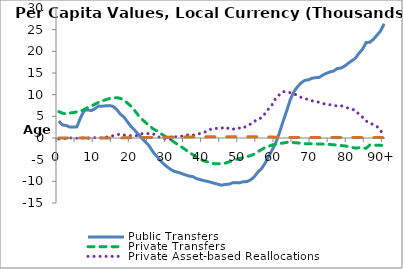
| Category | Public Transfers | Private Transfers | Private Asset-based Reallocations | Public Asset-based Reallocations |
|---|---|---|---|---|
| 0 | 3890.903 | 6072.071 | -239.489 | 11.454 |
|  | 3004.658 | 5733.146 | -129.32 | 11.052 |
| 2 | 2898.938 | 5558.263 | -123.643 | 10.962 |
| 3 | 2538.351 | 5765.566 | 31.755 | 11.675 |
| 4 | 2520.043 | 5865.47 | -28.736 | 11.757 |
| 5 | 2574.939 | 6041.667 | -48.814 | 12.055 |
| 6 | 4657.917 | 6203.658 | 57.806 | 12.59 |
| 7 | 6328.916 | 6565.576 | -17.849 | 13.173 |
| 8 | 6489.896 | 7024.428 | -88.521 | 13.949 |
| 9 | 6315.013 | 7386.108 | 114.454 | 15.058 |
| 10 | 6770.39 | 7797.061 | 62.626 | 15.775 |
| 11 | 7362.992 | 8229.034 | -2.205 | 16.516 |
| 12 | 7342.526 | 8565.643 | 37.488 | 17.297 |
| 13 | 7435.2 | 8837.892 | 176.451 | 18.186 |
| 14 | 7475.637 | 9098.178 | 309.88 | 19.114 |
| 15 | 7310.202 | 9264.6 | 537.142 | 20.316 |
| 16 | 6591.351 | 9297.038 | 756.72 | 21.948 |
| 17 | 5536.064 | 9150.241 | 872.325 | 24.902 |
| 18 | 4842.424 | 8746.116 | 699.413 | 30.167 |
| 19 | 3730.49 | 8037.224 | 485.42 | 38.417 |
| 20 | 2623.31 | 7327.816 | 526.604 | 51.885 |
| 21 | 1782.989 | 6306.438 | 478.152 | 65.104 |
| 22 | 833.711 | 5236.016 | 588.743 | 80.105 |
| 23 | -105.487 | 4337.669 | 991.015 | 96.345 |
| 24 | -914.425 | 3573.018 | 942.852 | 111.949 |
| 25 | -1813.864 | 2846.714 | 1050.449 | 127.424 |
| 26 | -3164.847 | 2166.082 | 1025.264 | 142.665 |
| 27 | -4150.197 | 1683.181 | 486.153 | 156.994 |
| 28 | -5105.101 | 1124.01 | 89.512 | 170.738 |
| 29 | -5999.932 | 600.542 | -75.174 | 183.392 |
| 30 | -6674.283 | 60.519 | -491.233 | 194.489 |
| 31 | -7269.5 | -390.679 | -229.478 | 204.487 |
| 32 | -7731.686 | -1003.997 | 264.818 | 213.219 |
| 33 | -7903.972 | -1542.354 | 350.355 | 221.182 |
| 34 | -8219.138 | -2097.933 | 418.895 | 228.856 |
| 35 | -8492.21 | -2654.446 | 722.299 | 236.716 |
| 36 | -8788.981 | -3277.642 | 700.284 | 243.306 |
| 37 | -8880.031 | -3807.561 | 634.379 | 248.879 |
| 38 | -9332.997 | -4356.459 | 876.948 | 254.602 |
| 39 | -9573.597 | -4845.975 | 1019.608 | 259.436 |
| 40 | -9805.478 | -5243.868 | 1332.815 | 262.58 |
| 41 | -9987.452 | -5473.298 | 1472.391 | 267.009 |
| 42 | -10194.808 | -5773.297 | 2033.005 | 271.368 |
| 43 | -10451.818 | -5925.972 | 2109.345 | 276.628 |
| 44 | -10663.894 | -5939.188 | 2280.779 | 281.188 |
| 45 | -10896.976 | -5900.416 | 2255.738 | 285.725 |
| 46 | -10712.946 | -5811.861 | 2580.457 | 287.635 |
| 47 | -10687.56 | -5532.233 | 2142.863 | 287.207 |
| 48 | -10354.735 | -5194.443 | 1964.635 | 286.962 |
| 49 | -10292.432 | -4971.496 | 2304.345 | 286.599 |
| 50 | -10355.942 | -4739.843 | 2292.722 | 285.445 |
| 51 | -10086.057 | -4508.158 | 2219.311 | 284.41 |
| 52 | -10063.013 | -4312.262 | 2880.903 | 282.646 |
| 53 | -9687.454 | -4066.95 | 3190.832 | 279.59 |
| 54 | -9024.25 | -3747.52 | 3747.241 | 273.552 |
| 55 | -7930.973 | -3186.602 | 4401.858 | 265.794 |
| 56 | -7130.295 | -2706.09 | 4611.521 | 253.68 |
| 57 | -5929.804 | -2240.01 | 5593.823 | 240.768 |
| 58 | -4307.227 | -1969.189 | 6708.199 | 224.757 |
| 59 | -2787.062 | -1595.1 | 7689.312 | 207.542 |
| 60 | -1121.412 | -1432.703 | 9179.656 | 189.911 |
| 61 | 1156.816 | -1270.82 | 9976.353 | 171.75 |
| 62 | 3756.658 | -1172.538 | 10681.986 | 154.62 |
| 63 | 6166.254 | -997.337 | 10708.474 | 140.9 |
| 64 | 8805.559 | -1015.164 | 10440.495 | 129.019 |
| 65 | 10646.391 | -1063.776 | 10208.785 | 120.576 |
| 66 | 11814.409 | -1127.445 | 9826.965 | 115.416 |
| 67 | 12691.341 | -1213.705 | 9400.503 | 112.356 |
| 68 | 13280.882 | -1315.736 | 9028.742 | 110.546 |
| 69 | 13413.54 | -1340.329 | 8928.094 | 109.444 |
| 70 | 13783.942 | -1348.452 | 8582.999 | 108.535 |
| 71 | 13920.992 | -1359.158 | 8434.614 | 107.828 |
| 72 | 13980.843 | -1377.882 | 8231.608 | 107.161 |
| 73 | 14512.075 | -1406.541 | 7982.705 | 106.683 |
| 74 | 14916.175 | -1428.826 | 7754.813 | 106.245 |
| 75 | 15246.758 | -1493.151 | 7673.281 | 105.863 |
| 76 | 15433.303 | -1569.313 | 7535.505 | 105.61 |
| 77 | 16020.14 | -1631.619 | 7364.81 | 105.161 |
| 78 | 16119.513 | -1736.321 | 7461.405 | 105.084 |
| 79 | 16560.236 | -1816.471 | 7209.084 | 104.757 |
| 80 | 17200.611 | -1969.54 | 6899.165 | 104.65 |
| 81 | 17813.214 | -2136.134 | 6643.814 | 104.818 |
| 82 | 18370.462 | -2346.976 | 6420.19 | 105.15 |
| 83 | 19534.003 | -2253.75 | 5487.735 | 105.609 |
| 84 | 20469.18 | -2332.701 | 4804.354 | 106.139 |
| 85 | 22041.502 | -2350.698 | 3938.214 | 105.571 |
| 86 | 22095.962 | -1631.089 | 3374.472 | 100.518 |
| 87 | 22755.781 | -1642.736 | 3130.514 | 96.021 |
| 88 | 23733.982 | -1669.703 | 2663.239 | 92.199 |
| 89 | 24698.608 | -1688.766 | 1741.765 | 90.435 |
| 90+ | 26377.726 | -1758.404 | 430.142 | 88.774 |